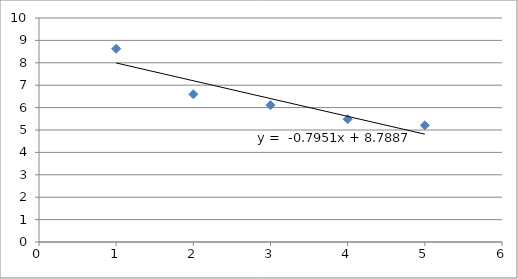
| Category | Series 0 |
|---|---|
| 0 | 8.628 |
| 1 | 6.592 |
| 2 | 6.108 |
| 3 | 5.48 |
| 4 | 5.209 |